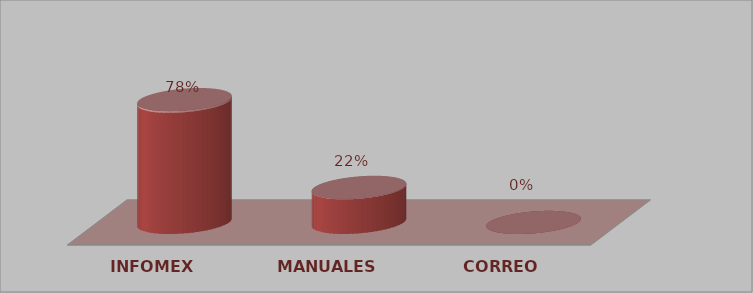
| Category | Series 0 | Series 1 |
|---|---|---|
| INFOMEX | 56 | 0.778 |
| MANUALES | 16 | 0.222 |
| CORREO | 0 | 0 |